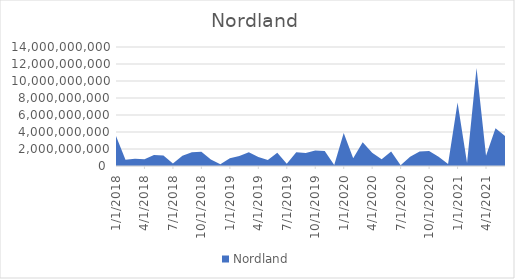
| Category | Nordland |
|---|---|
| 1/1/18 | 3529775000 |
| 2/1/18 | 729550000 |
| 3/1/18 | 839750000 |
| 4/1/18 | 787700000 |
| 5/1/18 | 1288350000 |
| 6/1/18 | 1242040000 |
| 7/1/18 | 299199000 |
| 8/1/18 | 1191450000 |
| 9/1/18 | 1620300000 |
| 10/1/18 | 1668430000 |
| 11/1/18 | 754550000 |
| 12/1/18 | 202530000 |
| 1/1/19 | 908780000 |
| 2/1/19 | 1170300000 |
| 3/1/19 | 1620750000 |
| 4/1/19 | 1057630000 |
| 5/1/19 | 717570000 |
| 6/1/19 | 1544530000 |
| 7/1/19 | 260750000 |
| 8/1/19 | 1617700000 |
| 9/1/19 | 1515400000 |
| 10/1/19 | 1826250000 |
| 11/1/19 | 1778650000 |
| 12/1/19 | 129100000 |
| 1/1/20 | 3887750000 |
| 2/1/20 | 903600000 |
| 3/1/20 | 2780450000 |
| 4/1/20 | 1550280000 |
| 5/1/20 | 806250000 |
| 6/1/20 | 1692750000 |
| 7/1/20 | 81400000 |
| 8/1/20 | 1091350000 |
| 9/1/20 | 1710250000 |
| 10/1/20 | 1766800000 |
| 11/1/20 | 1097100000 |
| 12/1/20 | 230000000 |
| 1/1/21 | 7475730000 |
| 2/1/21 | 342500000 |
| 3/1/21 | 11524900000 |
| 4/1/21 | 1203700000 |
| 5/1/21 | 4450550000 |
| 6/1/21 | 3519150000 |